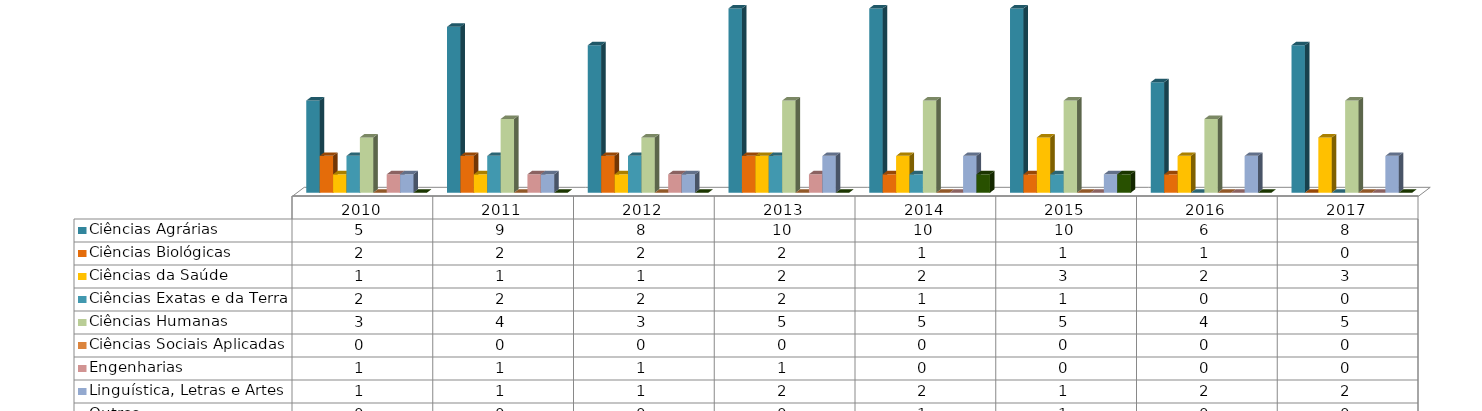
| Category | Ciências Agrárias  | Ciências Biológicas  | Ciências da Saúde  | Ciências Exatas e da Terra  | Ciências Humanas  | Ciências Sociais Aplicadas  | Engenharias  | Linguística, Letras e Artes  | Outros |
|---|---|---|---|---|---|---|---|---|---|
| 2010.0 | 5 | 2 | 1 | 2 | 3 | 0 | 1 | 1 | 0 |
| 2011.0 | 9 | 2 | 1 | 2 | 4 | 0 | 1 | 1 | 0 |
| 2012.0 | 8 | 2 | 1 | 2 | 3 | 0 | 1 | 1 | 0 |
| 2013.0 | 10 | 2 | 2 | 2 | 5 | 0 | 1 | 2 | 0 |
| 2014.0 | 10 | 1 | 2 | 1 | 5 | 0 | 0 | 2 | 1 |
| 2015.0 | 10 | 1 | 3 | 1 | 5 | 0 | 0 | 1 | 1 |
| 2016.0 | 6 | 1 | 2 | 0 | 4 | 0 | 0 | 2 | 0 |
| 2017.0 | 8 | 0 | 3 | 0 | 5 | 0 | 0 | 2 | 0 |